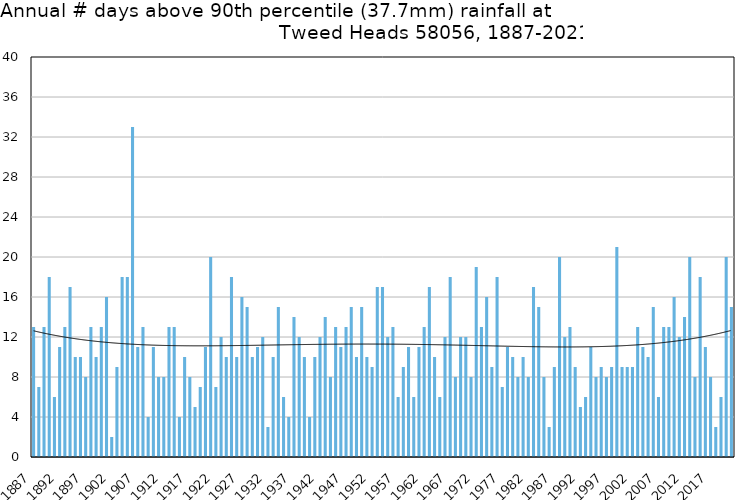
| Category | Annual # days above 90th percentile |
|---|---|
| 1887 | 13 |
| 1888 | 7 |
| 1889 | 13 |
| 1890 | 18 |
| 1891 | 6 |
| 1892 | 11 |
| 1893 | 13 |
| 1894 | 17 |
| 1895 | 10 |
| 1896 | 10 |
| 1897 | 8 |
| 1898 | 13 |
| 1899 | 10 |
| 1900 | 13 |
| 1901 | 16 |
| 1902 | 2 |
| 1903 | 9 |
| 1904 | 18 |
| 1905 | 18 |
| 1906 | 33 |
| 1907 | 11 |
| 1908 | 13 |
| 1909 | 4 |
| 1910 | 11 |
| 1911 | 8 |
| 1912 | 8 |
| 1913 | 13 |
| 1914 | 13 |
| 1915 | 4 |
| 1916 | 10 |
| 1917 | 8 |
| 1918 | 5 |
| 1919 | 7 |
| 1920 | 11 |
| 1921 | 20 |
| 1922 | 7 |
| 1923 | 12 |
| 1924 | 10 |
| 1925 | 18 |
| 1926 | 10 |
| 1927 | 16 |
| 1928 | 15 |
| 1929 | 10 |
| 1930 | 11 |
| 1931 | 12 |
| 1932 | 3 |
| 1933 | 10 |
| 1934 | 15 |
| 1935 | 6 |
| 1936 | 4 |
| 1937 | 14 |
| 1938 | 12 |
| 1939 | 10 |
| 1940 | 4 |
| 1941 | 10 |
| 1942 | 12 |
| 1943 | 14 |
| 1944 | 8 |
| 1945 | 13 |
| 1946 | 11 |
| 1947 | 13 |
| 1948 | 15 |
| 1949 | 10 |
| 1950 | 15 |
| 1951 | 10 |
| 1952 | 9 |
| 1953 | 17 |
| 1954 | 17 |
| 1955 | 12 |
| 1956 | 13 |
| 1957 | 6 |
| 1958 | 9 |
| 1959 | 11 |
| 1960 | 6 |
| 1961 | 11 |
| 1962 | 13 |
| 1963 | 17 |
| 1964 | 10 |
| 1965 | 6 |
| 1966 | 12 |
| 1967 | 18 |
| 1968 | 8 |
| 1969 | 12 |
| 1970 | 12 |
| 1971 | 8 |
| 1972 | 19 |
| 1973 | 13 |
| 1974 | 16 |
| 1975 | 9 |
| 1976 | 18 |
| 1977 | 7 |
| 1978 | 11 |
| 1979 | 10 |
| 1980 | 8 |
| 1981 | 10 |
| 1982 | 8 |
| 1983 | 17 |
| 1984 | 15 |
| 1985 | 8 |
| 1986 | 3 |
| 1987 | 9 |
| 1988 | 20 |
| 1989 | 12 |
| 1990 | 13 |
| 1991 | 9 |
| 1992 | 5 |
| 1993 | 6 |
| 1994 | 11 |
| 1995 | 8 |
| 1996 | 9 |
| 1997 | 8 |
| 1998 | 9 |
| 1999 | 21 |
| 2000 | 9 |
| 2001 | 9 |
| 2002 | 9 |
| 2003 | 13 |
| 2004 | 11 |
| 2005 | 10 |
| 2006 | 15 |
| 2007 | 6 |
| 2008 | 13 |
| 2009 | 13 |
| 2010 | 16 |
| 2011 | 12 |
| 2012 | 14 |
| 2013 | 20 |
| 2014 | 8 |
| 2015 | 18 |
| 2016 | 11 |
| 2017 | 8 |
| 2018 | 3 |
| 2019 | 6 |
| 2020 | 20 |
| 2021 | 15 |